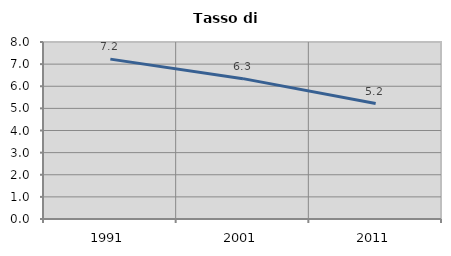
| Category | Tasso di disoccupazione   |
|---|---|
| 1991.0 | 7.226 |
| 2001.0 | 6.344 |
| 2011.0 | 5.217 |